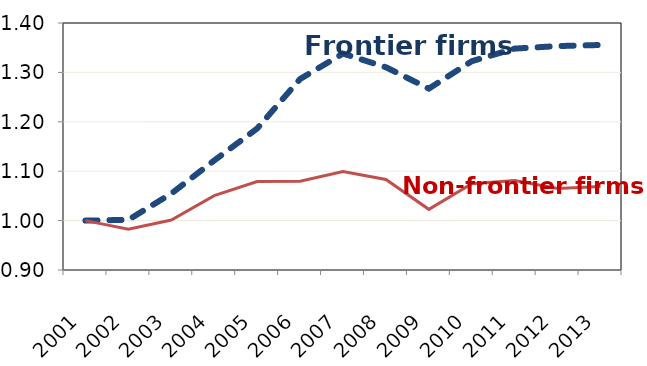
| Category | Average | Non-frontier |
|---|---|---|
| 2001.0 | 1 | 1 |
| 2002.0 | 1.002 | 0.983 |
| 2003.0 | 1.055 | 1.001 |
| 2004.0 | 1.122 | 1.05 |
| 2005.0 | 1.186 | 1.079 |
| 2006.0 | 1.287 | 1.08 |
| 2007.0 | 1.338 | 1.099 |
| 2008.0 | 1.31 | 1.083 |
| 2009.0 | 1.267 | 1.023 |
| 2010.0 | 1.323 | 1.075 |
| 2011.0 | 1.348 | 1.081 |
| 2012.0 | 1.353 | 1.065 |
| 2013.0 | 1.356 | 1.069 |